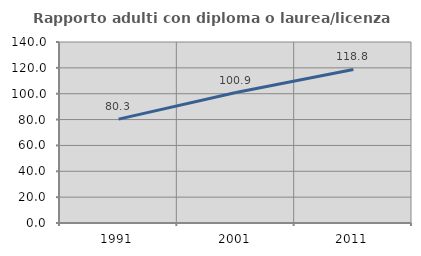
| Category | Rapporto adulti con diploma o laurea/licenza media  |
|---|---|
| 1991.0 | 80.328 |
| 2001.0 | 100.935 |
| 2011.0 | 118.8 |